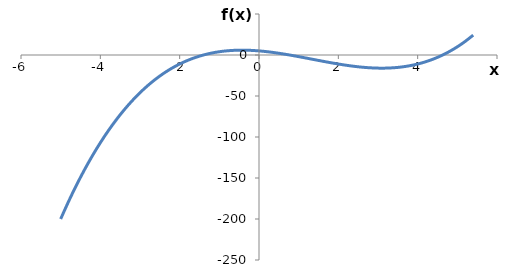
| Category | f(x) |
|---|---|
| -5.0 | -200 |
| -4.8 | -178.552 |
| -4.6 | -158.576 |
| -4.3999999999999995 | -140.024 |
| -4.199999999999999 | -122.848 |
| -3.999999999999999 | -107 |
| -3.799999999999999 | -92.432 |
| -3.5999999999999988 | -79.096 |
| -3.3999999999999986 | -66.944 |
| -3.1999999999999984 | -55.928 |
| -2.9999999999999982 | -46 |
| -2.799999999999998 | -37.112 |
| -2.599999999999998 | -29.216 |
| -2.3999999999999977 | -22.264 |
| -2.1999999999999975 | -16.208 |
| -1.9999999999999976 | -11 |
| -1.7999999999999976 | -6.592 |
| -1.5999999999999976 | -2.936 |
| -1.3999999999999977 | 0.016 |
| -1.1999999999999977 | 2.312 |
| -0.9999999999999978 | 4 |
| -0.7999999999999978 | 5.128 |
| -0.5999999999999979 | 5.744 |
| -0.39999999999999786 | 5.896 |
| -0.19999999999999785 | 5.632 |
| 2.1649348980190553e-15 | 5 |
| 0.20000000000000218 | 4.048 |
| 0.4000000000000022 | 2.824 |
| 0.6000000000000022 | 1.376 |
| 0.8000000000000023 | -0.248 |
| 1.0000000000000022 | -2 |
| 1.2000000000000022 | -3.832 |
| 1.4000000000000021 | -5.696 |
| 1.600000000000002 | -7.544 |
| 1.800000000000002 | -9.328 |
| 2.000000000000002 | -11 |
| 2.2000000000000024 | -12.512 |
| 2.4000000000000026 | -13.816 |
| 2.6000000000000028 | -14.864 |
| 2.800000000000003 | -15.608 |
| 3.000000000000003 | -16 |
| 3.2000000000000033 | -15.992 |
| 3.4000000000000035 | -15.536 |
| 3.6000000000000036 | -14.584 |
| 3.800000000000004 | -13.088 |
| 4.0000000000000036 | -11 |
| 4.200000000000004 | -8.272 |
| 4.400000000000004 | -4.856 |
| 4.600000000000004 | -0.704 |
| 4.800000000000004 | 4.232 |
| 5.000000000000004 | 10 |
| 5.200000000000005 | 16.648 |
| 5.400000000000005 | 24.224 |